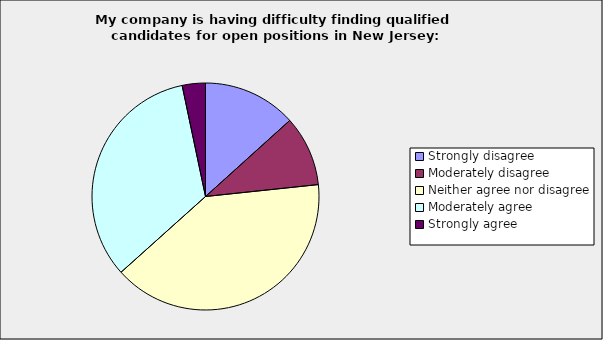
| Category | Series 0 |
|---|---|
| Strongly disagree | 0.133 |
| Moderately disagree | 0.1 |
| Neither agree nor disagree | 0.4 |
| Moderately agree | 0.333 |
| Strongly agree | 0.033 |